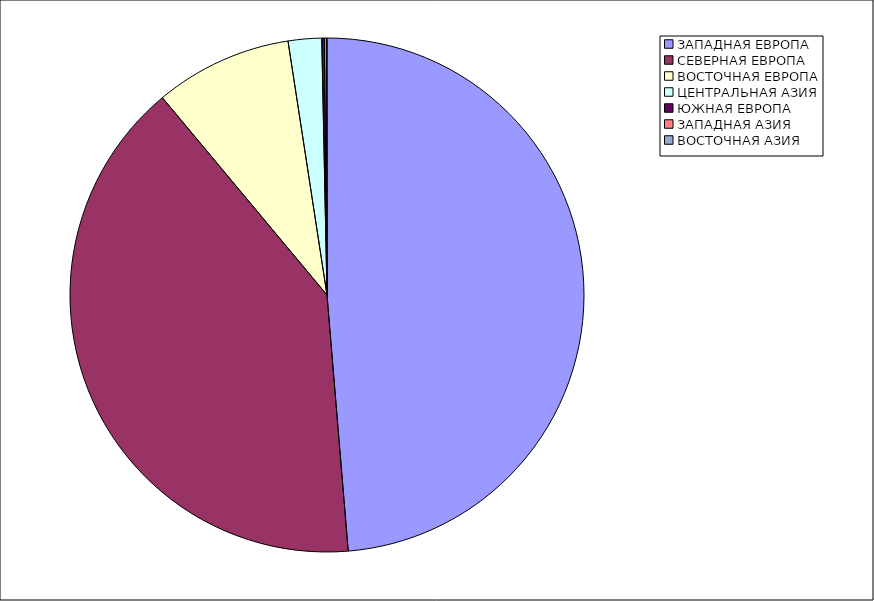
| Category | Оборот |
|---|---|
| ЗАПАДНАЯ ЕВРОПА | 48.683 |
| СЕВЕРНАЯ ЕВРОПА | 40.251 |
| ВОСТОЧНАЯ ЕВРОПА | 8.641 |
| ЦЕНТРАЛЬНАЯ АЗИЯ | 2.101 |
| ЮЖНАЯ ЕВРОПА | 0.161 |
| ЗАПАДНАЯ АЗИЯ | 0.13 |
| ВОСТОЧНАЯ АЗИЯ | 0.033 |